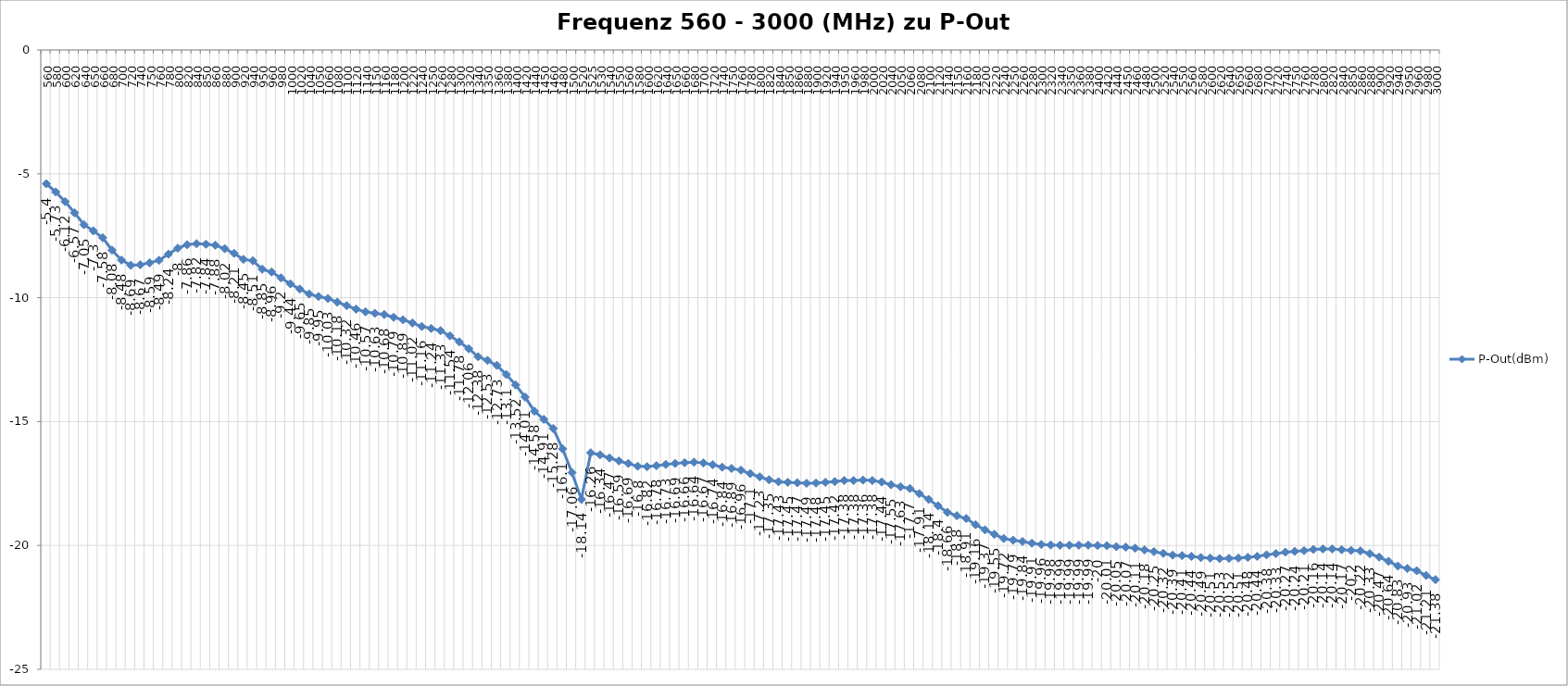
| Category | P-Out(dBm) |
|---|---|
| 560.0 | -5.4 |
| 580.0 | -5.73 |
| 600.0 | -6.12 |
| 620.0 | -6.57 |
| 640.0 | -7.05 |
| 650.0 | -7.3 |
| 660.0 | -7.58 |
| 680.0 | -8.08 |
| 700.0 | -8.48 |
| 720.0 | -8.69 |
| 740.0 | -8.67 |
| 750.0 | -8.59 |
| 760.0 | -8.49 |
| 780.0 | -8.24 |
| 800.0 | -8 |
| 820.0 | -7.86 |
| 840.0 | -7.82 |
| 850.0 | -7.84 |
| 860.0 | -7.88 |
| 880.0 | -8.02 |
| 900.0 | -8.21 |
| 920.0 | -8.45 |
| 940.0 | -8.51 |
| 950.0 | -8.85 |
| 960.0 | -8.96 |
| 980.0 | -9.2 |
| 1000.0 | -9.44 |
| 1020.0 | -9.65 |
| 1040.0 | -9.85 |
| 1050.0 | -9.95 |
| 1060.0 | -10.03 |
| 1080.0 | -10.18 |
| 1100.0 | -10.32 |
| 1120.0 | -10.46 |
| 1140.0 | -10.57 |
| 1150.0 | -10.63 |
| 1160.0 | -10.68 |
| 1180.0 | -10.79 |
| 1200.0 | -10.89 |
| 1220.0 | -11.02 |
| 1240.0 | -11.16 |
| 1250.0 | -11.24 |
| 1260.0 | -11.33 |
| 1280.0 | -11.54 |
| 1300.0 | -11.78 |
| 1320.0 | -12.06 |
| 1340.0 | -12.38 |
| 1350.0 | -12.53 |
| 1360.0 | -12.73 |
| 1380.0 | -13.1 |
| 1400.0 | -13.52 |
| 1420.0 | -14.01 |
| 1440.0 | -14.58 |
| 1450.0 | -14.91 |
| 1460.0 | -15.28 |
| 1480.0 | -16.1 |
| 1500.0 | -17.06 |
| 1520.0 | -18.14 |
| 1525.0 | -16.26 |
| 1530.0 | -16.34 |
| 1540.0 | -16.47 |
| 1550.0 | -16.59 |
| 1560.0 | -16.69 |
| 1580.0 | -16.8 |
| 1600.0 | -16.82 |
| 1620.0 | -16.78 |
| 1640.0 | -16.73 |
| 1650.0 | -16.69 |
| 1660.0 | -16.66 |
| 1680.0 | -16.64 |
| 1700.0 | -16.67 |
| 1720.0 | -16.74 |
| 1740.0 | -16.84 |
| 1750.0 | -16.89 |
| 1760.0 | -16.96 |
| 1780.0 | -17.1 |
| 1800.0 | -17.23 |
| 1820.0 | -17.35 |
| 1840.0 | -17.43 |
| 1850.0 | -17.45 |
| 1860.0 | -17.47 |
| 1880.0 | -17.49 |
| 1900.0 | -17.48 |
| 1920.0 | -17.45 |
| 1940.0 | -17.42 |
| 1950.0 | -17.38 |
| 1960.0 | -17.38 |
| 1980.0 | -17.36 |
| 2000.0 | -17.38 |
| 2020.0 | -17.44 |
| 2040.0 | -17.55 |
| 2050.0 | -17.63 |
| 2060.0 | -17.7 |
| 2080.0 | -17.91 |
| 2100.0 | -18.14 |
| 2120.0 | -18.4 |
| 2140.0 | -18.66 |
| 2150.0 | -18.8 |
| 2160.0 | -18.91 |
| 2180.0 | -19.16 |
| 2200.0 | -19.37 |
| 2220.0 | -19.55 |
| 2240.0 | -19.72 |
| 2250.0 | -19.79 |
| 2260.0 | -19.84 |
| 2280.0 | -19.91 |
| 2300.0 | -19.96 |
| 2320.0 | -19.98 |
| 2340.0 | -19.99 |
| 2350.0 | -19.99 |
| 2360.0 | -19.99 |
| 2380.0 | -19.99 |
| 2400.0 | -20 |
| 2420.0 | -20.01 |
| 2440.0 | -20.05 |
| 2450.0 | -20.07 |
| 2460.0 | -20.11 |
| 2480.0 | -20.18 |
| 2500.0 | -20.25 |
| 2520.0 | -20.32 |
| 2540.0 | -20.39 |
| 2550.0 | -20.41 |
| 2560.0 | -20.44 |
| 2580.0 | -20.49 |
| 2600.0 | -20.51 |
| 2620.0 | -20.53 |
| 2640.0 | -20.52 |
| 2650.0 | -20.51 |
| 2660.0 | -20.48 |
| 2680.0 | -20.44 |
| 2700.0 | -20.38 |
| 2720.0 | -20.33 |
| 2740.0 | -20.27 |
| 2750.0 | -20.24 |
| 2760.0 | -20.21 |
| 2780.0 | -20.16 |
| 2800.0 | -20.14 |
| 2820.0 | -20.14 |
| 2840.0 | -20.17 |
| 2850.0 | -20.2 |
| 2860.0 | -20.22 |
| 2880.0 | -20.33 |
| 2900.0 | -20.47 |
| 2920.0 | -20.64 |
| 2940.0 | -20.83 |
| 2950.0 | -20.93 |
| 2960.0 | -21.02 |
| 2980.0 | -21.21 |
| 3000.0 | -21.38 |